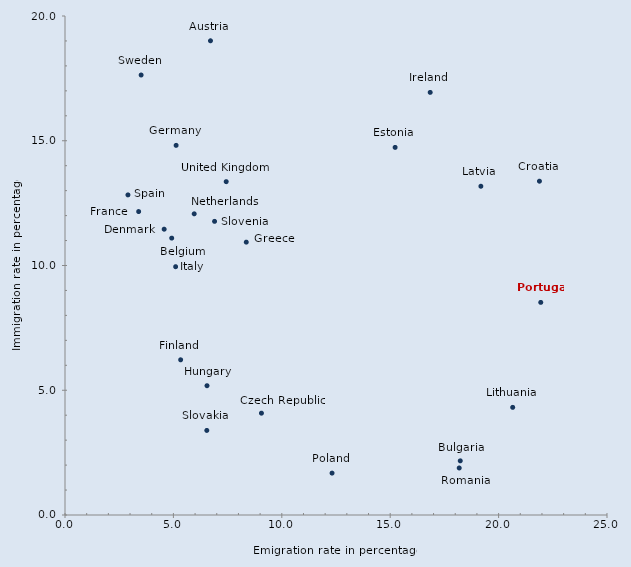
| Category | Series 0 |
|---|---|
| 6.710138558 | 19.006 |
| 4.922648175 | 11.098 |
| 18.23159088 | 2.171 |
| 21.88462037 | 13.379 |
| 9.061269018 | 4.081 |
| 4.574041462 | 11.455 |
| 15.22733104 | 14.734 |
| 5.334395755 | 6.221 |
| 3.396781092 | 12.162 |
| 5.124669996 | 14.815 |
| 8.361415595 | 10.936 |
| 6.550204551 | 5.182 |
| 16.84464043 | 16.938 |
| 5.103054419 | 9.952 |
| 19.18283607 | 13.176 |
| 20.65033455 | 4.315 |
| 5.959765761 | 12.072 |
| 12.31694342 | 1.679 |
| 21.94427304 | 8.521 |
| 18.18409653 | 1.884 |
| 6.540604024 | 3.389 |
| 6.899118067 | 11.769 |
| 2.903422962 | 12.83 |
| 3.511759663 | 17.635 |
| 7.436070019 | 13.36 |